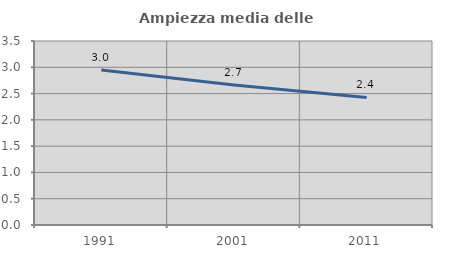
| Category | Ampiezza media delle famiglie |
|---|---|
| 1991.0 | 2.95 |
| 2001.0 | 2.663 |
| 2011.0 | 2.427 |